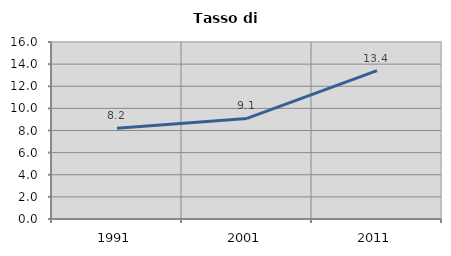
| Category | Tasso di disoccupazione   |
|---|---|
| 1991.0 | 8.197 |
| 2001.0 | 9.091 |
| 2011.0 | 13.415 |